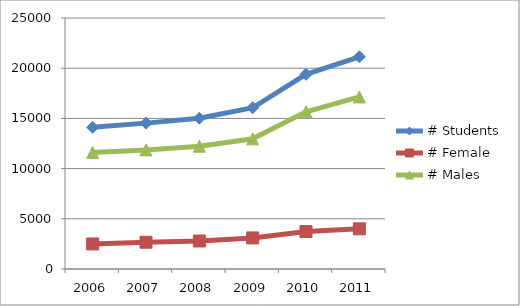
| Category | # Students | # Female | # Males |
|---|---|---|---|
| 2006.0 | 14108 | 2495 | 11613 |
| 2007.0 | 14529 | 2665 | 11864 |
| 2008.0 | 15014 | 2789 | 12225 |
| 2009.0 | 16061 | 3096 | 12965 |
| 2010.0 | 19390 | 3726 | 15664 |
| 2011.0 | 21139 | 4000 | 17139 |